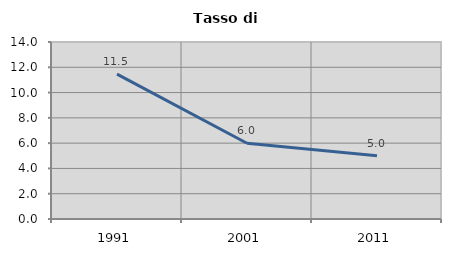
| Category | Tasso di disoccupazione   |
|---|---|
| 1991.0 | 11.462 |
| 2001.0 | 5.989 |
| 2011.0 | 5.008 |